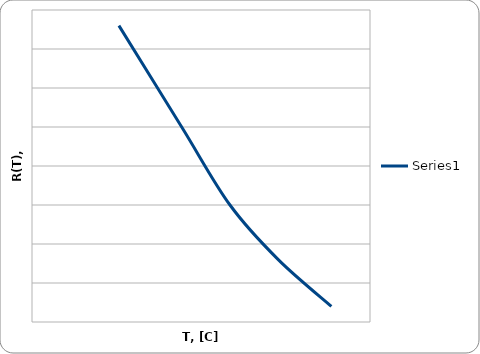
| Category | Series 0 |
|---|---|
| 18.0 | 4.783 |
| 31.0 | 4.77 |
| 41.0 | 4.76 |
| 51.0 | 4.753 |
| 62.0 | 4.747 |